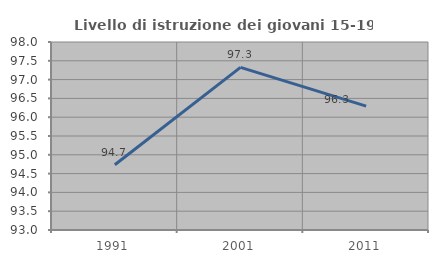
| Category | Livello di istruzione dei giovani 15-19 anni |
|---|---|
| 1991.0 | 94.737 |
| 2001.0 | 97.326 |
| 2011.0 | 96.296 |